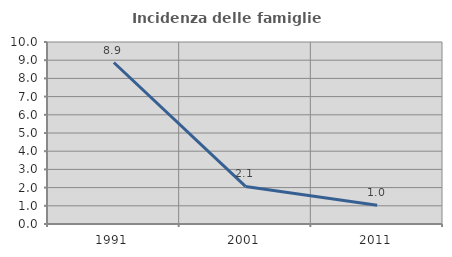
| Category | Incidenza delle famiglie numerose |
|---|---|
| 1991.0 | 8.872 |
| 2001.0 | 2.066 |
| 2011.0 | 1.035 |